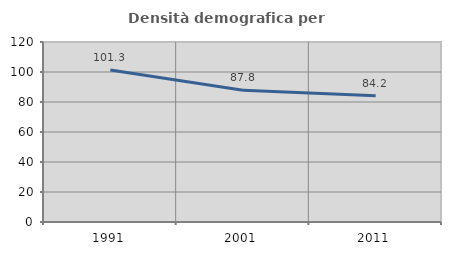
| Category | Densità demografica |
|---|---|
| 1991.0 | 101.337 |
| 2001.0 | 87.835 |
| 2011.0 | 84.234 |